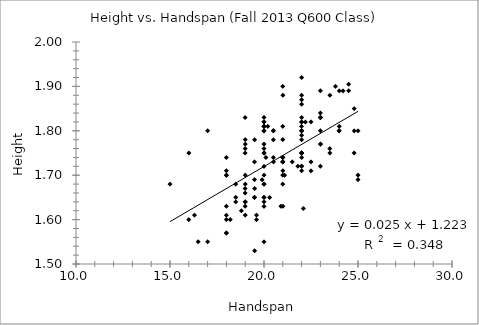
| Category | Series 0 |
|---|---|
| 19.5 | 1.53 |
| 16.5 | 1.55 |
| 17.0 | 1.55 |
| 20.0 | 1.55 |
| 18.0 | 1.57 |
| 18.0 | 1.57 |
| 19.6 | 1.6 |
| 16.0 | 1.6 |
| 18.0 | 1.6 |
| 18.2 | 1.6 |
| 19.6 | 1.61 |
| 18.0 | 1.61 |
| 16.3 | 1.61 |
| 19.0 | 1.61 |
| 18.8 | 1.62 |
| 19.0 | 1.63 |
| 20.0 | 1.63 |
| 18.0 | 1.63 |
| 21.0 | 1.63 |
| 19.0 | 1.64 |
| 19.0 | 1.64 |
| 20.0 | 1.64 |
| 18.5 | 1.64 |
| 18.5 | 1.65 |
| 20.0 | 1.65 |
| 19.5 | 1.65 |
| 19.5 | 1.65 |
| 20.3 | 1.65 |
| 20.0 | 1.65 |
| 19.5 | 1.67 |
| 19.0 | 1.67 |
| 15.0 | 1.68 |
| 20.0 | 1.68 |
| 18.5 | 1.68 |
| 19.0 | 1.68 |
| 20.0 | 1.68 |
| 21.0 | 1.68 |
| 19.9 | 1.69 |
| 20.0 | 1.7 |
| 21.1 | 1.7 |
| 18.0 | 1.7 |
| 18.0 | 1.7 |
| 21.8 | 1.72 |
| 19.5 | 1.73 |
| 21.0 | 1.73 |
| 18.0 | 1.74 |
| 20.1 | 1.74 |
| 21.0 | 1.74 |
| 19.0 | 1.76 |
| 20.0 | 1.77 |
| 19.0 | 1.77 |
| 19.5 | 1.78 |
| 20.5 | 1.78 |
| 20.5 | 1.8 |
| 24.0 | 1.81 |
| 22.1 | 1.625 |
| 20.9 | 1.63 |
| 19.0 | 1.66 |
| 25.0 | 1.69 |
| 19.5 | 1.69 |
| 21.0 | 1.7 |
| 25.0 | 1.7 |
| 19.0 | 1.7 |
| 22.5 | 1.71 |
| 22.0 | 1.71 |
| 18.0 | 1.71 |
| 21.0 | 1.71 |
| 20.0 | 1.72 |
| 22.0 | 1.72 |
| 23.0 | 1.72 |
| 22.0 | 1.72 |
| 22.5 | 1.73 |
| 20.5 | 1.73 |
| 21.0 | 1.73 |
| 21.0 | 1.73 |
| 21.5 | 1.73 |
| 20.5 | 1.74 |
| 21.0 | 1.74 |
| 22.0 | 1.74 |
| 21.0 | 1.74 |
| 24.8 | 1.75 |
| 19.0 | 1.75 |
| 16.0 | 1.75 |
| 22.0 | 1.75 |
| 20.0 | 1.75 |
| 20.0 | 1.75 |
| 23.5 | 1.75 |
| 22.0 | 1.75 |
| 22.0 | 1.75 |
| 22.0 | 1.75 |
| 20.0 | 1.76 |
| 23.5 | 1.76 |
| 23.0 | 1.77 |
| 23.0 | 1.77 |
| 22.0 | 1.78 |
| 19.0 | 1.78 |
| 21.0 | 1.78 |
| 22.0 | 1.79 |
| 20.0 | 1.8 |
| 24.0 | 1.8 |
| 22.0 | 1.8 |
| 24.8 | 1.8 |
| 22.0 | 1.8 |
| 23.0 | 1.8 |
| 22.0 | 1.8 |
| 20.5 | 1.8 |
| 17.0 | 1.8 |
| 25.0 | 1.8 |
| 20.0 | 1.8 |
| 24.0 | 1.8 |
| 22.0 | 1.81 |
| 20.0 | 1.81 |
| 20.0 | 1.81 |
| 20.0 | 1.81 |
| 20.2 | 1.81 |
| 21.0 | 1.81 |
| 22.2 | 1.82 |
| 22.0 | 1.82 |
| 20.0 | 1.82 |
| 22.5 | 1.82 |
| 22.0 | 1.82 |
| 20.0 | 1.82 |
| 20.0 | 1.83 |
| 23.0 | 1.83 |
| 23.0 | 1.83 |
| 19.0 | 1.83 |
| 22.0 | 1.83 |
| 23.0 | 1.83 |
| 23.0 | 1.84 |
| 24.8 | 1.85 |
| 22.0 | 1.86 |
| 22.0 | 1.87 |
| 21.0 | 1.88 |
| 22.0 | 1.88 |
| 23.5 | 1.88 |
| 24.5 | 1.89 |
| 24.2 | 1.89 |
| 24.0 | 1.89 |
| 23.0 | 1.89 |
| 21.0 | 1.9 |
| 23.8 | 1.9 |
| 24.5 | 1.905 |
| 22.0 | 1.92 |